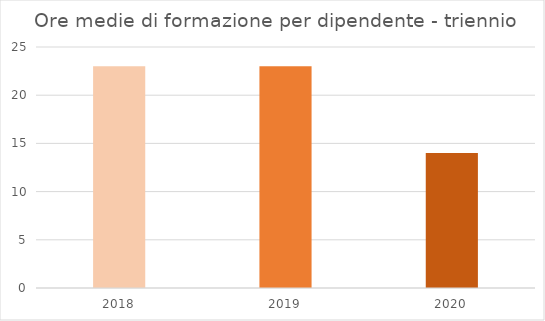
| Category | 2018 |
|---|---|
| 2018.0 | 23 |
| 2019.0 | 23 |
| 2020.0 | 14 |